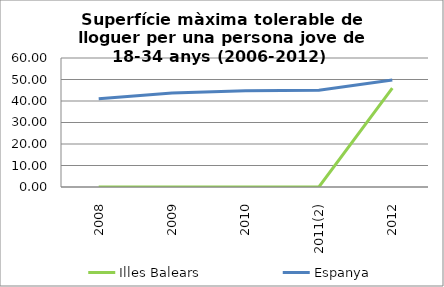
| Category | Illes Balears | Espanya |
|---|---|---|
| 2008 | 0 | 41 |
| 2009 | 0 | 43.7 |
| 2010 | 0 | 44.8 |
| 2011(2) | 0 | 45.033 |
| 2012 | 46 | 49.8 |